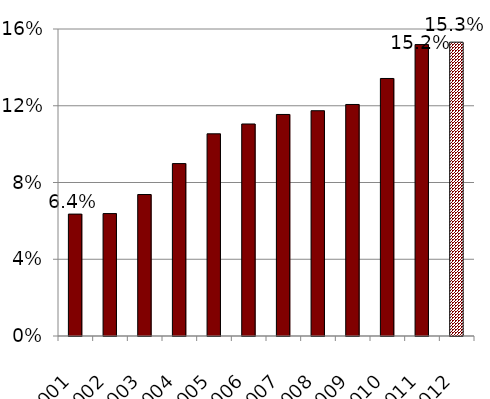
| Category | Series 0 |
|---|---|
| 2001.0 | 0.064 |
| 2002.0 | 0.064 |
| 2003.0 | 0.074 |
| 2004.0 | 0.09 |
| 2005.0 | 0.105 |
| 2006.0 | 0.11 |
| 2007.0 | 0.115 |
| 2008.0 | 0.117 |
| 2009.0 | 0.121 |
| 2010.0 | 0.134 |
| 2011.0 | 0.152 |
| 2012.0 | 0.153 |